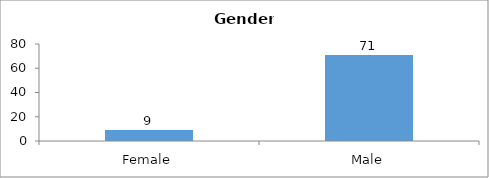
| Category | Gender |
|---|---|
| Female | 9 |
| Male | 71 |